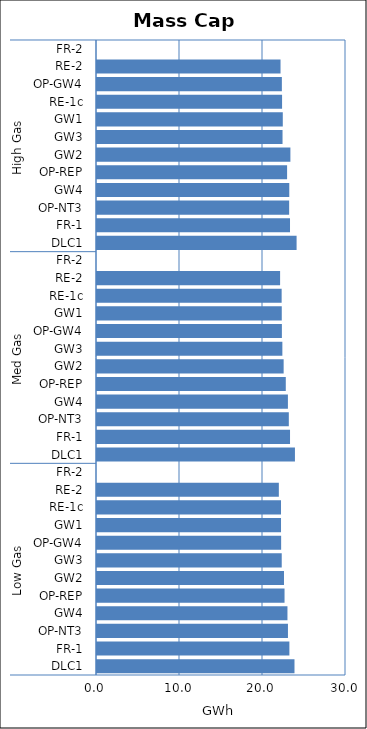
| Category | Mass Cap B |
|---|---|
| 0 | 23.794 |
| 1 | 23.179 |
| 2 | 23.006 |
| 3 | 22.946 |
| 4 | 22.595 |
| 5 | 22.53 |
| 6 | 22.257 |
| 7 | 22.186 |
| 8 | 22.171 |
| 9 | 22.169 |
| 10 | 21.909 |
| 11 | 0 |
| 12 | 23.848 |
| 13 | 23.257 |
| 14 | 23.111 |
| 15 | 23.002 |
| 16 | 22.745 |
| 17 | 22.487 |
| 18 | 22.333 |
| 19 | 22.275 |
| 20 | 22.261 |
| 21 | 22.247 |
| 22 | 22.061 |
| 23 | 0 |
| 24 | 24.048 |
| 25 | 23.254 |
| 26 | 23.151 |
| 27 | 23.167 |
| 28 | 22.903 |
| 29 | 23.301 |
| 30 | 22.354 |
| 31 | 22.384 |
| 32 | 22.298 |
| 33 | 22.273 |
| 34 | 22.112 |
| 35 | 0 |